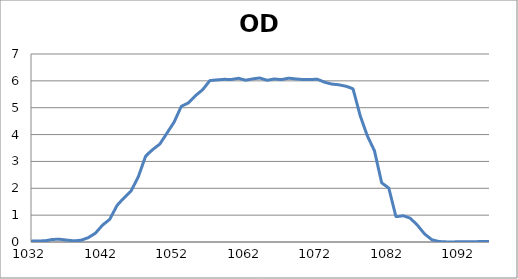
| Category | Series 0 |
|---|---|
| 2600.0 | 0.188 |
| 2599.0 | 0.186 |
| 2598.0 | 0.183 |
| 2597.0 | 0.181 |
| 2596.0 | 0.179 |
| 2595.0 | 0.178 |
| 2594.0 | 0.176 |
| 2593.0 | 0.175 |
| 2592.0 | 0.173 |
| 2591.0 | 0.172 |
| 2590.0 | 0.17 |
| 2589.0 | 0.169 |
| 2588.0 | 0.167 |
| 2587.0 | 0.166 |
| 2586.0 | 0.165 |
| 2585.0 | 0.164 |
| 2584.0 | 0.163 |
| 2583.0 | 0.162 |
| 2582.0 | 0.16 |
| 2581.0 | 0.158 |
| 2580.0 | 0.156 |
| 2579.0 | 0.154 |
| 2578.0 | 0.152 |
| 2577.0 | 0.15 |
| 2576.0 | 0.148 |
| 2575.0 | 0.145 |
| 2574.0 | 0.143 |
| 2573.0 | 0.141 |
| 2572.0 | 0.139 |
| 2571.0 | 0.137 |
| 2570.0 | 0.135 |
| 2569.0 | 0.133 |
| 2568.0 | 0.131 |
| 2567.0 | 0.13 |
| 2566.0 | 0.129 |
| 2565.0 | 0.128 |
| 2564.0 | 0.127 |
| 2563.0 | 0.127 |
| 2562.0 | 0.127 |
| 2561.0 | 0.127 |
| 2560.0 | 0.127 |
| 2559.0 | 0.127 |
| 2558.0 | 0.127 |
| 2557.0 | 0.127 |
| 2556.0 | 0.128 |
| 2555.0 | 0.128 |
| 2554.0 | 0.128 |
| 2553.0 | 0.128 |
| 2552.0 | 0.128 |
| 2551.0 | 0.128 |
| 2550.0 | 0.127 |
| 2549.0 | 0.127 |
| 2548.0 | 0.126 |
| 2547.0 | 0.124 |
| 2546.0 | 0.123 |
| 2545.0 | 0.122 |
| 2544.0 | 0.121 |
| 2543.0 | 0.12 |
| 2542.0 | 0.119 |
| 2541.0 | 0.118 |
| 2540.0 | 0.117 |
| 2539.0 | 0.117 |
| 2538.0 | 0.118 |
| 2537.0 | 0.118 |
| 2536.0 | 0.119 |
| 2535.0 | 0.12 |
| 2534.0 | 0.122 |
| 2533.0 | 0.124 |
| 2532.0 | 0.126 |
| 2531.0 | 0.128 |
| 2530.0 | 0.131 |
| 2529.0 | 0.134 |
| 2528.0 | 0.136 |
| 2527.0 | 0.139 |
| 2526.0 | 0.141 |
| 2525.0 | 0.144 |
| 2524.0 | 0.146 |
| 2523.0 | 0.148 |
| 2522.0 | 0.15 |
| 2521.0 | 0.151 |
| 2520.0 | 0.152 |
| 2519.0 | 0.153 |
| 2518.0 | 0.153 |
| 2517.0 | 0.153 |
| 2516.0 | 0.152 |
| 2515.0 | 0.151 |
| 2514.0 | 0.149 |
| 2513.0 | 0.148 |
| 2512.0 | 0.146 |
| 2511.0 | 0.144 |
| 2510.0 | 0.143 |
| 2509.0 | 0.141 |
| 2508.0 | 0.14 |
| 2507.0 | 0.139 |
| 2506.0 | 0.138 |
| 2505.0 | 0.137 |
| 2504.0 | 0.138 |
| 2503.0 | 0.138 |
| 2502.0 | 0.139 |
| 2501.0 | 0.141 |
| 2500.0 | 0.143 |
| 2499.0 | 0.145 |
| 2498.0 | 0.147 |
| 2497.0 | 0.15 |
| 2496.0 | 0.153 |
| 2495.0 | 0.155 |
| 2494.0 | 0.158 |
| 2493.0 | 0.161 |
| 2492.0 | 0.163 |
| 2491.0 | 0.165 |
| 2490.0 | 0.166 |
| 2489.0 | 0.167 |
| 2488.0 | 0.167 |
| 2487.0 | 0.167 |
| 2486.0 | 0.167 |
| 2485.0 | 0.165 |
| 2484.0 | 0.163 |
| 2483.0 | 0.161 |
| 2482.0 | 0.158 |
| 2481.0 | 0.155 |
| 2480.0 | 0.151 |
| 2479.0 | 0.147 |
| 2478.0 | 0.143 |
| 2477.0 | 0.139 |
| 2476.0 | 0.134 |
| 2475.0 | 0.13 |
| 2474.0 | 0.126 |
| 2473.0 | 0.122 |
| 2472.0 | 0.119 |
| 2471.0 | 0.115 |
| 2470.0 | 0.112 |
| 2469.0 | 0.11 |
| 2468.0 | 0.108 |
| 2467.0 | 0.106 |
| 2466.0 | 0.105 |
| 2465.0 | 0.104 |
| 2464.0 | 0.104 |
| 2463.0 | 0.103 |
| 2462.0 | 0.103 |
| 2461.0 | 0.103 |
| 2460.0 | 0.103 |
| 2459.0 | 0.103 |
| 2458.0 | 0.103 |
| 2457.0 | 0.103 |
| 2456.0 | 0.104 |
| 2455.0 | 0.104 |
| 2454.0 | 0.104 |
| 2453.0 | 0.104 |
| 2452.0 | 0.104 |
| 2451.0 | 0.104 |
| 2450.0 | 0.104 |
| 2449.0 | 0.104 |
| 2448.0 | 0.104 |
| 2447.0 | 0.105 |
| 2446.0 | 0.105 |
| 2445.0 | 0.106 |
| 2444.0 | 0.106 |
| 2443.0 | 0.107 |
| 2442.0 | 0.108 |
| 2441.0 | 0.108 |
| 2440.0 | 0.109 |
| 2439.0 | 0.11 |
| 2438.0 | 0.111 |
| 2437.0 | 0.112 |
| 2436.0 | 0.113 |
| 2435.0 | 0.113 |
| 2434.0 | 0.113 |
| 2433.0 | 0.114 |
| 2432.0 | 0.114 |
| 2431.0 | 0.113 |
| 2430.0 | 0.113 |
| 2429.0 | 0.113 |
| 2428.0 | 0.112 |
| 2427.0 | 0.112 |
| 2426.0 | 0.111 |
| 2425.0 | 0.111 |
| 2424.0 | 0.111 |
| 2423.0 | 0.111 |
| 2422.0 | 0.112 |
| 2421.0 | 0.113 |
| 2420.0 | 0.114 |
| 2419.0 | 0.116 |
| 2418.0 | 0.118 |
| 2417.0 | 0.12 |
| 2416.0 | 0.123 |
| 2415.0 | 0.126 |
| 2414.0 | 0.13 |
| 2413.0 | 0.133 |
| 2412.0 | 0.137 |
| 2411.0 | 0.14 |
| 2410.0 | 0.144 |
| 2409.0 | 0.147 |
| 2408.0 | 0.15 |
| 2407.0 | 0.153 |
| 2406.0 | 0.156 |
| 2405.0 | 0.158 |
| 2404.0 | 0.159 |
| 2403.0 | 0.161 |
| 2402.0 | 0.162 |
| 2401.0 | 0.162 |
| 2400.0 | 0.162 |
| 2399.0 | 0.162 |
| 2398.0 | 0.161 |
| 2397.0 | 0.16 |
| 2396.0 | 0.16 |
| 2395.0 | 0.16 |
| 2394.0 | 0.16 |
| 2393.0 | 0.16 |
| 2392.0 | 0.161 |
| 2391.0 | 0.162 |
| 2390.0 | 0.164 |
| 2389.0 | 0.166 |
| 2388.0 | 0.169 |
| 2387.0 | 0.172 |
| 2386.0 | 0.176 |
| 2385.0 | 0.18 |
| 2384.0 | 0.184 |
| 2383.0 | 0.189 |
| 2382.0 | 0.193 |
| 2381.0 | 0.197 |
| 2380.0 | 0.202 |
| 2379.0 | 0.205 |
| 2378.0 | 0.209 |
| 2377.0 | 0.211 |
| 2376.0 | 0.214 |
| 2375.0 | 0.215 |
| 2374.0 | 0.216 |
| 2373.0 | 0.216 |
| 2372.0 | 0.216 |
| 2371.0 | 0.215 |
| 2370.0 | 0.213 |
| 2369.0 | 0.212 |
| 2368.0 | 0.21 |
| 2367.0 | 0.208 |
| 2366.0 | 0.206 |
| 2365.0 | 0.203 |
| 2364.0 | 0.202 |
| 2363.0 | 0.2 |
| 2362.0 | 0.199 |
| 2361.0 | 0.198 |
| 2360.0 | 0.198 |
| 2359.0 | 0.198 |
| 2358.0 | 0.198 |
| 2357.0 | 0.198 |
| 2356.0 | 0.199 |
| 2355.0 | 0.201 |
| 2354.0 | 0.202 |
| 2353.0 | 0.203 |
| 2352.0 | 0.204 |
| 2351.0 | 0.205 |
| 2350.0 | 0.205 |
| 2349.0 | 0.205 |
| 2348.0 | 0.205 |
| 2347.0 | 0.203 |
| 2346.0 | 0.202 |
| 2345.0 | 0.199 |
| 2344.0 | 0.197 |
| 2343.0 | 0.193 |
| 2342.0 | 0.19 |
| 2341.0 | 0.187 |
| 2340.0 | 0.183 |
| 2339.0 | 0.18 |
| 2338.0 | 0.177 |
| 2337.0 | 0.174 |
| 2336.0 | 0.172 |
| 2335.0 | 0.17 |
| 2334.0 | 0.168 |
| 2333.0 | 0.168 |
| 2332.0 | 0.167 |
| 2331.0 | 0.168 |
| 2330.0 | 0.168 |
| 2329.0 | 0.169 |
| 2328.0 | 0.17 |
| 2327.0 | 0.171 |
| 2326.0 | 0.172 |
| 2325.0 | 0.173 |
| 2324.0 | 0.173 |
| 2323.0 | 0.173 |
| 2322.0 | 0.173 |
| 2321.0 | 0.172 |
| 2320.0 | 0.17 |
| 2319.0 | 0.168 |
| 2318.0 | 0.166 |
| 2317.0 | 0.164 |
| 2316.0 | 0.162 |
| 2315.0 | 0.16 |
| 2314.0 | 0.158 |
| 2313.0 | 0.157 |
| 2312.0 | 0.157 |
| 2311.0 | 0.157 |
| 2310.0 | 0.159 |
| 2309.0 | 0.162 |
| 2308.0 | 0.167 |
| 2307.0 | 0.172 |
| 2306.0 | 0.178 |
| 2305.0 | 0.185 |
| 2304.0 | 0.192 |
| 2303.0 | 0.2 |
| 2302.0 | 0.208 |
| 2301.0 | 0.216 |
| 2300.0 | 0.223 |
| 2299.0 | 0.23 |
| 2298.0 | 0.235 |
| 2297.0 | 0.239 |
| 2296.0 | 0.241 |
| 2295.0 | 0.243 |
| 2294.0 | 0.243 |
| 2293.0 | 0.242 |
| 2292.0 | 0.24 |
| 2291.0 | 0.236 |
| 2290.0 | 0.232 |
| 2289.0 | 0.228 |
| 2288.0 | 0.223 |
| 2287.0 | 0.218 |
| 2286.0 | 0.215 |
| 2285.0 | 0.212 |
| 2284.0 | 0.21 |
| 2283.0 | 0.21 |
| 2282.0 | 0.211 |
| 2281.0 | 0.215 |
| 2280.0 | 0.22 |
| 2279.0 | 0.227 |
| 2278.0 | 0.235 |
| 2277.0 | 0.245 |
| 2276.0 | 0.256 |
| 2275.0 | 0.268 |
| 2274.0 | 0.281 |
| 2273.0 | 0.293 |
| 2272.0 | 0.304 |
| 2271.0 | 0.315 |
| 2270.0 | 0.324 |
| 2269.0 | 0.331 |
| 2268.0 | 0.337 |
| 2267.0 | 0.341 |
| 2266.0 | 0.344 |
| 2265.0 | 0.345 |
| 2264.0 | 0.344 |
| 2263.0 | 0.341 |
| 2262.0 | 0.338 |
| 2261.0 | 0.333 |
| 2260.0 | 0.329 |
| 2259.0 | 0.323 |
| 2258.0 | 0.318 |
| 2257.0 | 0.313 |
| 2256.0 | 0.309 |
| 2255.0 | 0.306 |
| 2254.0 | 0.304 |
| 2253.0 | 0.302 |
| 2252.0 | 0.303 |
| 2251.0 | 0.304 |
| 2250.0 | 0.306 |
| 2249.0 | 0.309 |
| 2248.0 | 0.312 |
| 2247.0 | 0.316 |
| 2246.0 | 0.319 |
| 2245.0 | 0.323 |
| 2244.0 | 0.325 |
| 2243.0 | 0.327 |
| 2242.0 | 0.328 |
| 2241.0 | 0.328 |
| 2240.0 | 0.326 |
| 2239.0 | 0.323 |
| 2238.0 | 0.319 |
| 2237.0 | 0.313 |
| 2236.0 | 0.306 |
| 2235.0 | 0.298 |
| 2234.0 | 0.291 |
| 2233.0 | 0.283 |
| 2232.0 | 0.275 |
| 2231.0 | 0.267 |
| 2230.0 | 0.261 |
| 2229.0 | 0.256 |
| 2228.0 | 0.251 |
| 2227.0 | 0.248 |
| 2226.0 | 0.246 |
| 2225.0 | 0.245 |
| 2224.0 | 0.246 |
| 2223.0 | 0.247 |
| 2222.0 | 0.249 |
| 2221.0 | 0.252 |
| 2220.0 | 0.254 |
| 2219.0 | 0.257 |
| 2218.0 | 0.259 |
| 2217.0 | 0.261 |
| 2216.0 | 0.262 |
| 2215.0 | 0.262 |
| 2214.0 | 0.263 |
| 2213.0 | 0.262 |
| 2212.0 | 0.262 |
| 2211.0 | 0.261 |
| 2210.0 | 0.26 |
| 2209.0 | 0.259 |
| 2208.0 | 0.259 |
| 2207.0 | 0.26 |
| 2206.0 | 0.261 |
| 2205.0 | 0.263 |
| 2204.0 | 0.266 |
| 2203.0 | 0.271 |
| 2202.0 | 0.276 |
| 2201.0 | 0.282 |
| 2200.0 | 0.289 |
| 2199.0 | 0.296 |
| 2198.0 | 0.303 |
| 2197.0 | 0.311 |
| 2196.0 | 0.318 |
| 2195.0 | 0.326 |
| 2194.0 | 0.333 |
| 2193.0 | 0.339 |
| 2192.0 | 0.345 |
| 2191.0 | 0.35 |
| 2190.0 | 0.356 |
| 2189.0 | 0.36 |
| 2188.0 | 0.365 |
| 2187.0 | 0.369 |
| 2186.0 | 0.373 |
| 2185.0 | 0.376 |
| 2184.0 | 0.38 |
| 2183.0 | 0.383 |
| 2182.0 | 0.386 |
| 2181.0 | 0.389 |
| 2180.0 | 0.392 |
| 2179.0 | 0.394 |
| 2178.0 | 0.396 |
| 2177.0 | 0.397 |
| 2176.0 | 0.398 |
| 2175.0 | 0.397 |
| 2174.0 | 0.397 |
| 2173.0 | 0.395 |
| 2172.0 | 0.393 |
| 2171.0 | 0.39 |
| 2170.0 | 0.387 |
| 2169.0 | 0.383 |
| 2168.0 | 0.38 |
| 2167.0 | 0.377 |
| 2166.0 | 0.375 |
| 2165.0 | 0.373 |
| 2164.0 | 0.373 |
| 2163.0 | 0.374 |
| 2162.0 | 0.377 |
| 2161.0 | 0.382 |
| 2160.0 | 0.388 |
| 2159.0 | 0.395 |
| 2158.0 | 0.404 |
| 2157.0 | 0.414 |
| 2156.0 | 0.424 |
| 2155.0 | 0.434 |
| 2154.0 | 0.443 |
| 2153.0 | 0.451 |
| 2152.0 | 0.458 |
| 2151.0 | 0.463 |
| 2150.0 | 0.466 |
| 2149.0 | 0.466 |
| 2148.0 | 0.464 |
| 2147.0 | 0.459 |
| 2146.0 | 0.451 |
| 2145.0 | 0.442 |
| 2144.0 | 0.431 |
| 2143.0 | 0.418 |
| 2142.0 | 0.404 |
| 2141.0 | 0.39 |
| 2140.0 | 0.375 |
| 2139.0 | 0.363 |
| 2138.0 | 0.353 |
| 2137.0 | 0.344 |
| 2136.0 | 0.338 |
| 2135.0 | 0.335 |
| 2134.0 | 0.334 |
| 2133.0 | 0.336 |
| 2132.0 | 0.341 |
| 2131.0 | 0.347 |
| 2130.0 | 0.354 |
| 2129.0 | 0.362 |
| 2128.0 | 0.369 |
| 2127.0 | 0.376 |
| 2126.0 | 0.381 |
| 2125.0 | 0.384 |
| 2124.0 | 0.385 |
| 2123.0 | 0.383 |
| 2122.0 | 0.378 |
| 2121.0 | 0.371 |
| 2120.0 | 0.362 |
| 2119.0 | 0.35 |
| 2118.0 | 0.337 |
| 2117.0 | 0.322 |
| 2116.0 | 0.308 |
| 2115.0 | 0.294 |
| 2114.0 | 0.281 |
| 2113.0 | 0.27 |
| 2112.0 | 0.262 |
| 2111.0 | 0.257 |
| 2110.0 | 0.254 |
| 2109.0 | 0.255 |
| 2108.0 | 0.257 |
| 2107.0 | 0.261 |
| 2106.0 | 0.266 |
| 2105.0 | 0.272 |
| 2104.0 | 0.277 |
| 2103.0 | 0.28 |
| 2102.0 | 0.283 |
| 2101.0 | 0.284 |
| 2100.0 | 0.283 |
| 2099.0 | 0.28 |
| 2098.0 | 0.275 |
| 2097.0 | 0.27 |
| 2096.0 | 0.264 |
| 2095.0 | 0.258 |
| 2094.0 | 0.253 |
| 2093.0 | 0.249 |
| 2092.0 | 0.247 |
| 2091.0 | 0.246 |
| 2090.0 | 0.249 |
| 2089.0 | 0.253 |
| 2088.0 | 0.26 |
| 2087.0 | 0.268 |
| 2086.0 | 0.278 |
| 2085.0 | 0.289 |
| 2084.0 | 0.299 |
| 2083.0 | 0.309 |
| 2082.0 | 0.318 |
| 2081.0 | 0.324 |
| 2080.0 | 0.329 |
| 2079.0 | 0.331 |
| 2078.0 | 0.33 |
| 2077.0 | 0.328 |
| 2076.0 | 0.324 |
| 2075.0 | 0.318 |
| 2074.0 | 0.311 |
| 2073.0 | 0.305 |
| 2072.0 | 0.3 |
| 2071.0 | 0.296 |
| 2070.0 | 0.296 |
| 2069.0 | 0.298 |
| 2068.0 | 0.303 |
| 2067.0 | 0.311 |
| 2066.0 | 0.321 |
| 2065.0 | 0.333 |
| 2064.0 | 0.346 |
| 2063.0 | 0.36 |
| 2062.0 | 0.373 |
| 2061.0 | 0.384 |
| 2060.0 | 0.394 |
| 2059.0 | 0.401 |
| 2058.0 | 0.406 |
| 2057.0 | 0.407 |
| 2056.0 | 0.406 |
| 2055.0 | 0.403 |
| 2054.0 | 0.397 |
| 2053.0 | 0.39 |
| 2052.0 | 0.381 |
| 2051.0 | 0.373 |
| 2050.0 | 0.364 |
| 2049.0 | 0.356 |
| 2048.0 | 0.349 |
| 2047.0 | 0.345 |
| 2046.0 | 0.343 |
| 2045.0 | 0.344 |
| 2044.0 | 0.346 |
| 2043.0 | 0.351 |
| 2042.0 | 0.356 |
| 2041.0 | 0.362 |
| 2040.0 | 0.368 |
| 2039.0 | 0.373 |
| 2038.0 | 0.375 |
| 2037.0 | 0.376 |
| 2036.0 | 0.374 |
| 2035.0 | 0.37 |
| 2034.0 | 0.362 |
| 2033.0 | 0.353 |
| 2032.0 | 0.342 |
| 2031.0 | 0.33 |
| 2030.0 | 0.317 |
| 2029.0 | 0.305 |
| 2028.0 | 0.295 |
| 2027.0 | 0.288 |
| 2026.0 | 0.283 |
| 2025.0 | 0.281 |
| 2024.0 | 0.282 |
| 2023.0 | 0.286 |
| 2022.0 | 0.293 |
| 2021.0 | 0.3 |
| 2020.0 | 0.309 |
| 2019.0 | 0.316 |
| 2018.0 | 0.323 |
| 2017.0 | 0.329 |
| 2016.0 | 0.332 |
| 2015.0 | 0.333 |
| 2014.0 | 0.332 |
| 2013.0 | 0.329 |
| 2012.0 | 0.325 |
| 2011.0 | 0.319 |
| 2010.0 | 0.314 |
| 2009.0 | 0.31 |
| 2008.0 | 0.306 |
| 2007.0 | 0.305 |
| 2006.0 | 0.306 |
| 2005.0 | 0.309 |
| 2004.0 | 0.315 |
| 2003.0 | 0.323 |
| 2002.0 | 0.334 |
| 2001.0 | 0.345 |
| 2000.0 | 0.356 |
| 1999.0 | 0.367 |
| 1998.0 | 0.376 |
| 1997.0 | 0.384 |
| 1996.0 | 0.389 |
| 1995.0 | 0.391 |
| 1994.0 | 0.391 |
| 1993.0 | 0.389 |
| 1992.0 | 0.385 |
| 1991.0 | 0.38 |
| 1990.0 | 0.376 |
| 1989.0 | 0.372 |
| 1988.0 | 0.369 |
| 1987.0 | 0.369 |
| 1986.0 | 0.371 |
| 1985.0 | 0.376 |
| 1984.0 | 0.383 |
| 1983.0 | 0.393 |
| 1982.0 | 0.404 |
| 1981.0 | 0.415 |
| 1980.0 | 0.426 |
| 1979.0 | 0.436 |
| 1978.0 | 0.445 |
| 1977.0 | 0.452 |
| 1976.0 | 0.456 |
| 1975.0 | 0.457 |
| 1974.0 | 0.456 |
| 1973.0 | 0.453 |
| 1972.0 | 0.447 |
| 1971.0 | 0.441 |
| 1970.0 | 0.434 |
| 1969.0 | 0.425 |
| 1968.0 | 0.418 |
| 1967.0 | 0.412 |
| 1966.0 | 0.408 |
| 1965.0 | 0.406 |
| 1964.0 | 0.405 |
| 1963.0 | 0.408 |
| 1962.0 | 0.411 |
| 1961.0 | 0.415 |
| 1960.0 | 0.419 |
| 1959.0 | 0.423 |
| 1958.0 | 0.426 |
| 1957.0 | 0.428 |
| 1956.0 | 0.427 |
| 1955.0 | 0.424 |
| 1954.0 | 0.419 |
| 1953.0 | 0.412 |
| 1952.0 | 0.403 |
| 1951.0 | 0.393 |
| 1950.0 | 0.383 |
| 1949.0 | 0.373 |
| 1948.0 | 0.364 |
| 1947.0 | 0.356 |
| 1946.0 | 0.35 |
| 1945.0 | 0.346 |
| 1944.0 | 0.343 |
| 1943.0 | 0.342 |
| 1942.0 | 0.341 |
| 1941.0 | 0.34 |
| 1940.0 | 0.34 |
| 1939.0 | 0.339 |
| 1938.0 | 0.336 |
| 1937.0 | 0.333 |
| 1936.0 | 0.328 |
| 1935.0 | 0.323 |
| 1934.0 | 0.317 |
| 1933.0 | 0.311 |
| 1932.0 | 0.306 |
| 1931.0 | 0.302 |
| 1930.0 | 0.3 |
| 1929.0 | 0.3 |
| 1928.0 | 0.301 |
| 1927.0 | 0.304 |
| 1926.0 | 0.308 |
| 1925.0 | 0.312 |
| 1924.0 | 0.316 |
| 1923.0 | 0.319 |
| 1922.0 | 0.322 |
| 1921.0 | 0.323 |
| 1920.0 | 0.323 |
| 1919.0 | 0.32 |
| 1918.0 | 0.316 |
| 1917.0 | 0.311 |
| 1916.0 | 0.305 |
| 1915.0 | 0.301 |
| 1914.0 | 0.3 |
| 1913.0 | 0.302 |
| 1912.0 | 0.307 |
| 1911.0 | 0.314 |
| 1910.0 | 0.323 |
| 1909.0 | 0.334 |
| 1908.0 | 0.347 |
| 1907.0 | 0.364 |
| 1906.0 | 0.382 |
| 1905.0 | 0.398 |
| 1904.0 | 0.409 |
| 1903.0 | 0.416 |
| 1902.0 | 0.419 |
| 1901.0 | 0.42 |
| 1900.0 | 0.417 |
| 1899.0 | 0.414 |
| 1898.0 | 0.41 |
| 1897.0 | 0.405 |
| 1896.0 | 0.401 |
| 1895.0 | 0.399 |
| 1894.0 | 0.401 |
| 1893.0 | 0.408 |
| 1892.0 | 0.421 |
| 1891.0 | 0.437 |
| 1890.0 | 0.454 |
| 1889.0 | 0.473 |
| 1888.0 | 0.49 |
| 1887.0 | 0.506 |
| 1886.0 | 0.52 |
| 1885.0 | 0.533 |
| 1884.0 | 0.542 |
| 1883.0 | 0.545 |
| 1882.0 | 0.542 |
| 1881.0 | 0.533 |
| 1880.0 | 0.519 |
| 1879.0 | 0.501 |
| 1878.0 | 0.479 |
| 1877.0 | 0.457 |
| 1876.0 | 0.437 |
| 1875.0 | 0.418 |
| 1874.0 | 0.404 |
| 1873.0 | 0.397 |
| 1872.0 | 0.394 |
| 1871.0 | 0.397 |
| 1870.0 | 0.407 |
| 1869.0 | 0.419 |
| 1868.0 | 0.433 |
| 1867.0 | 0.444 |
| 1866.0 | 0.454 |
| 1865.0 | 0.46 |
| 1864.0 | 0.462 |
| 1863.0 | 0.461 |
| 1862.0 | 0.455 |
| 1861.0 | 0.444 |
| 1860.0 | 0.43 |
| 1859.0 | 0.411 |
| 1858.0 | 0.392 |
| 1857.0 | 0.372 |
| 1856.0 | 0.352 |
| 1855.0 | 0.335 |
| 1854.0 | 0.32 |
| 1853.0 | 0.31 |
| 1852.0 | 0.303 |
| 1851.0 | 0.3 |
| 1850.0 | 0.3 |
| 1849.0 | 0.303 |
| 1848.0 | 0.31 |
| 1847.0 | 0.317 |
| 1846.0 | 0.322 |
| 1845.0 | 0.324 |
| 1844.0 | 0.323 |
| 1843.0 | 0.321 |
| 1842.0 | 0.318 |
| 1841.0 | 0.317 |
| 1840.0 | 0.313 |
| 1839.0 | 0.307 |
| 1838.0 | 0.301 |
| 1837.0 | 0.293 |
| 1836.0 | 0.286 |
| 1835.0 | 0.28 |
| 1834.0 | 0.274 |
| 1833.0 | 0.269 |
| 1832.0 | 0.264 |
| 1831.0 | 0.262 |
| 1830.0 | 0.261 |
| 1829.0 | 0.263 |
| 1828.0 | 0.268 |
| 1827.0 | 0.277 |
| 1826.0 | 0.288 |
| 1825.0 | 0.3 |
| 1824.0 | 0.313 |
| 1823.0 | 0.327 |
| 1822.0 | 0.344 |
| 1821.0 | 0.361 |
| 1820.0 | 0.376 |
| 1819.0 | 0.384 |
| 1818.0 | 0.386 |
| 1817.0 | 0.384 |
| 1816.0 | 0.378 |
| 1815.0 | 0.368 |
| 1814.0 | 0.356 |
| 1813.0 | 0.342 |
| 1812.0 | 0.327 |
| 1811.0 | 0.314 |
| 1810.0 | 0.305 |
| 1809.0 | 0.303 |
| 1808.0 | 0.308 |
| 1807.0 | 0.32 |
| 1806.0 | 0.34 |
| 1805.0 | 0.364 |
| 1804.0 | 0.391 |
| 1803.0 | 0.417 |
| 1802.0 | 0.44 |
| 1801.0 | 0.458 |
| 1800.0 | 0.471 |
| 1799.0 | 0.475 |
| 1798.0 | 0.47 |
| 1797.0 | 0.457 |
| 1796.0 | 0.437 |
| 1795.0 | 0.411 |
| 1794.0 | 0.381 |
| 1793.0 | 0.352 |
| 1792.0 | 0.325 |
| 1791.0 | 0.305 |
| 1790.0 | 0.295 |
| 1789.0 | 0.294 |
| 1788.0 | 0.304 |
| 1787.0 | 0.32 |
| 1786.0 | 0.341 |
| 1785.0 | 0.362 |
| 1784.0 | 0.382 |
| 1783.0 | 0.395 |
| 1782.0 | 0.402 |
| 1781.0 | 0.4 |
| 1780.0 | 0.39 |
| 1779.0 | 0.374 |
| 1778.0 | 0.351 |
| 1777.0 | 0.326 |
| 1776.0 | 0.299 |
| 1775.0 | 0.273 |
| 1774.0 | 0.253 |
| 1773.0 | 0.239 |
| 1772.0 | 0.232 |
| 1771.0 | 0.232 |
| 1770.0 | 0.238 |
| 1769.0 | 0.248 |
| 1768.0 | 0.259 |
| 1767.0 | 0.268 |
| 1766.0 | 0.274 |
| 1765.0 | 0.275 |
| 1764.0 | 0.27 |
| 1763.0 | 0.259 |
| 1762.0 | 0.247 |
| 1761.0 | 0.234 |
| 1760.0 | 0.224 |
| 1759.0 | 0.22 |
| 1758.0 | 0.224 |
| 1757.0 | 0.237 |
| 1756.0 | 0.258 |
| 1755.0 | 0.285 |
| 1754.0 | 0.314 |
| 1753.0 | 0.342 |
| 1752.0 | 0.367 |
| 1751.0 | 0.384 |
| 1750.0 | 0.393 |
| 1749.0 | 0.393 |
| 1748.0 | 0.384 |
| 1747.0 | 0.368 |
| 1746.0 | 0.345 |
| 1745.0 | 0.32 |
| 1744.0 | 0.295 |
| 1743.0 | 0.275 |
| 1742.0 | 0.263 |
| 1741.0 | 0.26 |
| 1740.0 | 0.268 |
| 1739.0 | 0.285 |
| 1738.0 | 0.309 |
| 1737.0 | 0.335 |
| 1736.0 | 0.361 |
| 1735.0 | 0.383 |
| 1734.0 | 0.4 |
| 1733.0 | 0.41 |
| 1732.0 | 0.412 |
| 1731.0 | 0.406 |
| 1730.0 | 0.393 |
| 1729.0 | 0.373 |
| 1728.0 | 0.349 |
| 1727.0 | 0.323 |
| 1726.0 | 0.296 |
| 1725.0 | 0.273 |
| 1724.0 | 0.253 |
| 1723.0 | 0.24 |
| 1722.0 | 0.232 |
| 1721.0 | 0.229 |
| 1720.0 | 0.23 |
| 1719.0 | 0.233 |
| 1718.0 | 0.236 |
| 1717.0 | 0.238 |
| 1716.0 | 0.236 |
| 1715.0 | 0.232 |
| 1714.0 | 0.224 |
| 1713.0 | 0.216 |
| 1712.0 | 0.206 |
| 1711.0 | 0.197 |
| 1710.0 | 0.189 |
| 1709.0 | 0.182 |
| 1708.0 | 0.178 |
| 1707.0 | 0.175 |
| 1706.0 | 0.174 |
| 1705.0 | 0.173 |
| 1704.0 | 0.172 |
| 1703.0 | 0.172 |
| 1702.0 | 0.172 |
| 1701.0 | 0.173 |
| 1700.0 | 0.176 |
| 1699.0 | 0.182 |
| 1698.0 | 0.19 |
| 1697.0 | 0.201 |
| 1696.0 | 0.215 |
| 1695.0 | 0.229 |
| 1694.0 | 0.244 |
| 1693.0 | 0.257 |
| 1692.0 | 0.267 |
| 1691.0 | 0.273 |
| 1690.0 | 0.274 |
| 1689.0 | 0.27 |
| 1688.0 | 0.261 |
| 1687.0 | 0.247 |
| 1686.0 | 0.231 |
| 1685.0 | 0.214 |
| 1684.0 | 0.199 |
| 1683.0 | 0.188 |
| 1682.0 | 0.182 |
| 1681.0 | 0.183 |
| 1680.0 | 0.191 |
| 1679.0 | 0.203 |
| 1678.0 | 0.219 |
| 1677.0 | 0.235 |
| 1676.0 | 0.249 |
| 1675.0 | 0.258 |
| 1674.0 | 0.262 |
| 1673.0 | 0.261 |
| 1672.0 | 0.253 |
| 1671.0 | 0.241 |
| 1670.0 | 0.225 |
| 1669.0 | 0.207 |
| 1668.0 | 0.189 |
| 1667.0 | 0.175 |
| 1666.0 | 0.163 |
| 1665.0 | 0.156 |
| 1664.0 | 0.153 |
| 1663.0 | 0.154 |
| 1662.0 | 0.157 |
| 1661.0 | 0.16 |
| 1660.0 | 0.164 |
| 1659.0 | 0.166 |
| 1658.0 | 0.166 |
| 1657.0 | 0.165 |
| 1656.0 | 0.162 |
| 1655.0 | 0.158 |
| 1654.0 | 0.154 |
| 1653.0 | 0.15 |
| 1652.0 | 0.146 |
| 1651.0 | 0.143 |
| 1650.0 | 0.142 |
| 1649.0 | 0.14 |
| 1648.0 | 0.14 |
| 1647.0 | 0.138 |
| 1646.0 | 0.137 |
| 1645.0 | 0.135 |
| 1644.0 | 0.132 |
| 1643.0 | 0.129 |
| 1642.0 | 0.127 |
| 1641.0 | 0.125 |
| 1640.0 | 0.125 |
| 1639.0 | 0.126 |
| 1638.0 | 0.128 |
| 1637.0 | 0.132 |
| 1636.0 | 0.136 |
| 1635.0 | 0.14 |
| 1634.0 | 0.142 |
| 1633.0 | 0.143 |
| 1632.0 | 0.141 |
| 1631.0 | 0.138 |
| 1630.0 | 0.132 |
| 1629.0 | 0.126 |
| 1628.0 | 0.12 |
| 1627.0 | 0.114 |
| 1626.0 | 0.11 |
| 1625.0 | 0.108 |
| 1624.0 | 0.109 |
| 1623.0 | 0.112 |
| 1622.0 | 0.117 |
| 1621.0 | 0.122 |
| 1620.0 | 0.127 |
| 1619.0 | 0.131 |
| 1618.0 | 0.133 |
| 1617.0 | 0.133 |
| 1616.0 | 0.131 |
| 1615.0 | 0.127 |
| 1614.0 | 0.122 |
| 1613.0 | 0.116 |
| 1612.0 | 0.11 |
| 1611.0 | 0.106 |
| 1610.0 | 0.104 |
| 1609.0 | 0.103 |
| 1608.0 | 0.105 |
| 1607.0 | 0.108 |
| 1606.0 | 0.111 |
| 1605.0 | 0.115 |
| 1604.0 | 0.118 |
| 1603.0 | 0.12 |
| 1602.0 | 0.119 |
| 1601.0 | 0.117 |
| 1600.0 | 0.113 |
| 1599.0 | 0.107 |
| 1598.0 | 0.103 |
| 1597.0 | 0.098 |
| 1596.0 | 0.096 |
| 1595.0 | 0.095 |
| 1594.0 | 0.096 |
| 1593.0 | 0.099 |
| 1592.0 | 0.103 |
| 1591.0 | 0.106 |
| 1590.0 | 0.108 |
| 1589.0 | 0.108 |
| 1588.0 | 0.106 |
| 1587.0 | 0.103 |
| 1586.0 | 0.098 |
| 1585.0 | 0.093 |
| 1584.0 | 0.088 |
| 1583.0 | 0.085 |
| 1582.0 | 0.083 |
| 1581.0 | 0.083 |
| 1580.0 | 0.085 |
| 1579.0 | 0.087 |
| 1578.0 | 0.089 |
| 1577.0 | 0.09 |
| 1576.0 | 0.09 |
| 1575.0 | 0.088 |
| 1574.0 | 0.084 |
| 1573.0 | 0.08 |
| 1572.0 | 0.075 |
| 1571.0 | 0.071 |
| 1570.0 | 0.069 |
| 1569.0 | 0.068 |
| 1568.0 | 0.069 |
| 1567.0 | 0.071 |
| 1566.0 | 0.073 |
| 1565.0 | 0.076 |
| 1564.0 | 0.077 |
| 1563.0 | 0.076 |
| 1562.0 | 0.073 |
| 1561.0 | 0.069 |
| 1560.0 | 0.064 |
| 1559.0 | 0.059 |
| 1558.0 | 0.056 |
| 1557.0 | 0.055 |
| 1556.0 | 0.056 |
| 1555.0 | 0.06 |
| 1554.0 | 0.064 |
| 1553.0 | 0.068 |
| 1552.0 | 0.071 |
| 1551.0 | 0.071 |
| 1550.0 | 0.069 |
| 1549.0 | 0.065 |
| 1548.0 | 0.06 |
| 1547.0 | 0.054 |
| 1546.0 | 0.05 |
| 1545.0 | 0.047 |
| 1544.0 | 0.047 |
| 1543.0 | 0.049 |
| 1542.0 | 0.052 |
| 1541.0 | 0.056 |
| 1540.0 | 0.059 |
| 1539.0 | 0.06 |
| 1538.0 | 0.059 |
| 1537.0 | 0.056 |
| 1536.0 | 0.052 |
| 1535.0 | 0.047 |
| 1534.0 | 0.042 |
| 1533.0 | 0.039 |
| 1532.0 | 0.038 |
| 1531.0 | 0.039 |
| 1530.0 | 0.04 |
| 1529.0 | 0.042 |
| 1528.0 | 0.044 |
| 1527.0 | 0.044 |
| 1526.0 | 0.044 |
| 1525.0 | 0.042 |
| 1524.0 | 0.04 |
| 1523.0 | 0.038 |
| 1522.0 | 0.038 |
| 1521.0 | 0.039 |
| 1520.0 | 0.041 |
| 1519.0 | 0.045 |
| 1518.0 | 0.048 |
| 1517.0 | 0.05 |
| 1516.0 | 0.049 |
| 1515.0 | 0.046 |
| 1514.0 | 0.042 |
| 1513.0 | 0.035 |
| 1512.0 | 0.03 |
| 1511.0 | 0.027 |
| 1510.0 | 0.026 |
| 1509.0 | 0.029 |
| 1508.0 | 0.033 |
| 1507.0 | 0.039 |
| 1506.0 | 0.043 |
| 1505.0 | 0.045 |
| 1504.0 | 0.045 |
| 1503.0 | 0.041 |
| 1502.0 | 0.036 |
| 1501.0 | 0.03 |
| 1500.0 | 0.024 |
| 1499.0 | 0.021 |
| 1498.0 | 0.022 |
| 1497.0 | 0.025 |
| 1496.0 | 0.03 |
| 1495.0 | 0.036 |
| 1494.0 | 0.04 |
| 1493.0 | 0.042 |
| 1492.0 | 0.041 |
| 1491.0 | 0.037 |
| 1490.0 | 0.031 |
| 1489.0 | 0.025 |
| 1488.0 | 0.02 |
| 1487.0 | 0.017 |
| 1486.0 | 0.017 |
| 1485.0 | 0.021 |
| 1484.0 | 0.026 |
| 1483.0 | 0.031 |
| 1482.0 | 0.035 |
| 1481.0 | 0.035 |
| 1480.0 | 0.032 |
| 1479.0 | 0.027 |
| 1478.0 | 0.021 |
| 1477.0 | 0.016 |
| 1476.0 | 0.013 |
| 1475.0 | 0.015 |
| 1474.0 | 0.021 |
| 1473.0 | 0.028 |
| 1472.0 | 0.036 |
| 1471.0 | 0.043 |
| 1470.0 | 0.046 |
| 1469.0 | 0.045 |
| 1468.0 | 0.039 |
| 1467.0 | 0.031 |
| 1466.0 | 0.023 |
| 1465.0 | 0.016 |
| 1464.0 | 0.012 |
| 1463.0 | 0.01 |
| 1462.0 | 0.013 |
| 1461.0 | 0.016 |
| 1460.0 | 0.021 |
| 1459.0 | 0.025 |
| 1458.0 | 0.027 |
| 1457.0 | 0.027 |
| 1456.0 | 0.025 |
| 1455.0 | 0.021 |
| 1454.0 | 0.017 |
| 1453.0 | 0.014 |
| 1452.0 | 0.011 |
| 1451.0 | 0.01 |
| 1450.0 | 0.01 |
| 1449.0 | 0.01 |
| 1448.0 | 0.011 |
| 1447.0 | 0.012 |
| 1446.0 | 0.011 |
| 1445.0 | 0.01 |
| 1444.0 | 0.009 |
| 1443.0 | 0.007 |
| 1442.0 | 0.006 |
| 1441.0 | 0.005 |
| 1440.0 | 0.005 |
| 1439.0 | 0.005 |
| 1438.0 | 0.006 |
| 1437.0 | 0.006 |
| 1436.0 | 0.006 |
| 1435.0 | 0.006 |
| 1434.0 | 0.005 |
| 1433.0 | 0.005 |
| 1432.0 | 0.005 |
| 1431.0 | 0.005 |
| 1430.0 | 0.005 |
| 1429.0 | 0.005 |
| 1428.0 | 0.005 |
| 1427.0 | 0.005 |
| 1426.0 | 0.005 |
| 1425.0 | 0.004 |
| 1424.0 | 0.004 |
| 1423.0 | 0.004 |
| 1422.0 | 0.004 |
| 1421.0 | 0.004 |
| 1420.0 | 0.004 |
| 1419.0 | 0.005 |
| 1418.0 | 0.005 |
| 1417.0 | 0.005 |
| 1416.0 | 0.005 |
| 1415.0 | 0.005 |
| 1414.0 | 0.006 |
| 1413.0 | 0.006 |
| 1412.0 | 0.007 |
| 1411.0 | 0.007 |
| 1410.0 | 0.008 |
| 1409.0 | 0.007 |
| 1408.0 | 0.007 |
| 1407.0 | 0.007 |
| 1406.0 | 0.007 |
| 1405.0 | 0.007 |
| 1404.0 | 0.007 |
| 1403.0 | 0.007 |
| 1402.0 | 0.008 |
| 1401.0 | 0.009 |
| 1400.0 | 0.022 |
| 1399.0 | 0.026 |
| 1398.0 | 0.002 |
| 1397.0 | 0.003 |
| 1396.0 | 0.009 |
| 1395.0 | 0.02 |
| 1394.0 | 0.022 |
| 1393.0 | 0 |
| 1392.0 | 0.01 |
| 1391.0 | 0.005 |
| 1390.0 | 0.028 |
| 1389.0 | 0.05 |
| 1388.0 | 0.057 |
| 1387.0 | 0.049 |
| 1386.0 | 0.028 |
| 1385.0 | 0.004 |
| 1384.0 | 0.001 |
| 1383.0 | 0.008 |
| 1382.0 | 0.03 |
| 1381.0 | 0.056 |
| 1380.0 | 0.031 |
| 1379.0 | 0.018 |
| 1378.0 | 0.012 |
| 1377.0 | 0.002 |
| 1376.0 | 0.001 |
| 1375.0 | 0.004 |
| 1374.0 | 0.014 |
| 1373.0 | 0.026 |
| 1372.0 | 0.039 |
| 1371.0 | 0.034 |
| 1370.0 | 0.027 |
| 1369.0 | 0.022 |
| 1368.0 | 0.005 |
| 1367.0 | 0.017 |
| 1366.0 | 0.01 |
| 1365.0 | 0.012 |
| 1364.0 | 0.007 |
| 1363.0 | 0.006 |
| 1362.0 | 0.013 |
| 1361.0 | 0.009 |
| 1360.0 | 0.03 |
| 1359.0 | 0.028 |
| 1358.0 | 0.012 |
| 1357.0 | 0.018 |
| 1356.0 | 0.015 |
| 1355.0 | 0.013 |
| 1354.0 | 0.026 |
| 1353.0 | 0.022 |
| 1352.0 | 0.005 |
| 1351.0 | 0.001 |
| 1350.0 | 0.002 |
| 1349.0 | 0.003 |
| 1348.0 | 0.003 |
| 1347.0 | 0.001 |
| 1346.0 | 0.003 |
| 1345.0 | 0 |
| 1344.0 | 0.007 |
| 1343.0 | 0.026 |
| 1342.0 | 0.001 |
| 1341.0 | 0 |
| 1340.0 | 0.002 |
| 1339.0 | 0.007 |
| 1338.0 | 0.002 |
| 1337.0 | 0 |
| 1336.0 | 0.027 |
| 1335.0 | 0.032 |
| 1334.0 | 0.034 |
| 1333.0 | 0.029 |
| 1332.0 | 0.001 |
| 1331.0 | 0.013 |
| 1330.0 | 0.015 |
| 1329.0 | 0.005 |
| 1328.0 | 0.01 |
| 1327.0 | 0 |
| 1326.0 | 0.002 |
| 1325.0 | 0.005 |
| 1324.0 | 0.001 |
| 1323.0 | 0.002 |
| 1322.0 | 0.003 |
| 1321.0 | 0.007 |
| 1320.0 | 0.001 |
| 1319.0 | 0.006 |
| 1318.0 | 0.015 |
| 1317.0 | 0.033 |
| 1316.0 | 0.038 |
| 1315.0 | 0.031 |
| 1314.0 | 0.016 |
| 1313.0 | 0.003 |
| 1312.0 | 0.008 |
| 1311.0 | 0.005 |
| 1310.0 | 0.001 |
| 1309.0 | 0.006 |
| 1308.0 | 0.025 |
| 1307.0 | 0.027 |
| 1306.0 | 0.002 |
| 1305.0 | 0.005 |
| 1304.0 | 0.002 |
| 1303.0 | 0.004 |
| 1302.0 | 0.002 |
| 1301.0 | 0.001 |
| 1300.0 | 0.001 |
| 1299.0 | 0.025 |
| 1298.0 | 0.033 |
| 1297.0 | 0.023 |
| 1296.0 | 0.004 |
| 1295.0 | 0.008 |
| 1294.0 | 0.007 |
| 1293.0 | 0.005 |
| 1292.0 | 0.005 |
| 1291.0 | 0.026 |
| 1290.0 | 0.023 |
| 1289.0 | 0.001 |
| 1288.0 | 0.011 |
| 1287.0 | 0.007 |
| 1286.0 | 0.001 |
| 1285.0 | 0.006 |
| 1284.0 | 0.003 |
| 1283.0 | 0.006 |
| 1282.0 | 0.01 |
| 1281.0 | 0.003 |
| 1280.0 | 0.015 |
| 1279.0 | 0.032 |
| 1278.0 | 0.029 |
| 1277.0 | 0.02 |
| 1276.0 | 0.002 |
| 1275.0 | 0.005 |
| 1274.0 | 0.005 |
| 1273.0 | 0.003 |
| 1272.0 | 0.009 |
| 1271.0 | 0.003 |
| 1270.0 | 0.004 |
| 1269.0 | 0.002 |
| 1268.0 | 0.009 |
| 1267.0 | 0.006 |
| 1266.0 | 0.014 |
| 1265.0 | 0.023 |
| 1264.0 | 0.006 |
| 1263.0 | 0.007 |
| 1262.0 | 0.001 |
| 1261.0 | 0.007 |
| 1260.0 | 0.006 |
| 1259.0 | 0.001 |
| 1258.0 | 0.002 |
| 1257.0 | 0.002 |
| 1256.0 | 0.002 |
| 1255.0 | 0 |
| 1254.0 | 0.007 |
| 1253.0 | 0.02 |
| 1252.0 | 0.042 |
| 1251.0 | 0.041 |
| 1250.0 | 0.019 |
| 1249.0 | 0.007 |
| 1248.0 | 0.008 |
| 1247.0 | 0.003 |
| 1246.0 | 0 |
| 1245.0 | 0.001 |
| 1244.0 | 0 |
| 1243.0 | 0.002 |
| 1242.0 | 0.01 |
| 1241.0 | 0.029 |
| 1240.0 | 0.034 |
| 1239.0 | 0.022 |
| 1238.0 | 0.001 |
| 1237.0 | 0.004 |
| 1236.0 | 0.006 |
| 1235.0 | 0.009 |
| 1234.0 | 0.009 |
| 1233.0 | 0.003 |
| 1232.0 | 0.007 |
| 1231.0 | 0.009 |
| 1230.0 | 0.008 |
| 1229.0 | 0.005 |
| 1228.0 | 0.014 |
| 1227.0 | 0.026 |
| 1226.0 | 0.015 |
| 1225.0 | 0.004 |
| 1224.0 | 0.005 |
| 1223.0 | 0.004 |
| 1222.0 | 0.008 |
| 1221.0 | 0.029 |
| 1220.0 | 0.038 |
| 1219.0 | 0.019 |
| 1218.0 | 0 |
| 1217.0 | 0.002 |
| 1216.0 | 0.005 |
| 1215.0 | 0.001 |
| 1214.0 | 0 |
| 1213.0 | 0.003 |
| 1212.0 | 0.001 |
| 1211.0 | 0.002 |
| 1210.0 | 0.014 |
| 1209.0 | 0.005 |
| 1208.0 | 0.019 |
| 1207.0 | 0.016 |
| 1206.0 | 0.011 |
| 1205.0 | 0.009 |
| 1204.0 | 0.03 |
| 1203.0 | 0.024 |
| 1202.0 | 0.005 |
| 1201.0 | 0.002 |
| 1200.0 | 0.006 |
| 1199.0 | 0.013 |
| 1198.0 | 0.03 |
| 1197.0 | 0.014 |
| 1196.0 | 0.003 |
| 1195.0 | 0.001 |
| 1194.0 | 0.001 |
| 1193.0 | 0.002 |
| 1192.0 | 0.003 |
| 1191.0 | 0 |
| 1190.0 | 0.013 |
| 1189.0 | 0.014 |
| 1188.0 | 0.004 |
| 1187.0 | 0.009 |
| 1186.0 | 0.016 |
| 1185.0 | 0.01 |
| 1184.0 | 0.007 |
| 1183.0 | 0.008 |
| 1182.0 | 0.013 |
| 1181.0 | 0.011 |
| 1180.0 | 0.005 |
| 1179.0 | 0.005 |
| 1178.0 | 0.006 |
| 1177.0 | 0.01 |
| 1176.0 | 0.026 |
| 1175.0 | 0.025 |
| 1174.0 | 0.018 |
| 1173.0 | 0.017 |
| 1172.0 | 0.008 |
| 1171.0 | 0.018 |
| 1170.0 | 0.03 |
| 1169.0 | 0.03 |
| 1168.0 | 0.025 |
| 1167.0 | 0.02 |
| 1166.0 | 0.018 |
| 1165.0 | 0.013 |
| 1164.0 | 0.018 |
| 1163.0 | 0.023 |
| 1162.0 | 0.017 |
| 1161.0 | 0.01 |
| 1160.0 | 0.005 |
| 1159.0 | 0.005 |
| 1158.0 | 0.015 |
| 1157.0 | 0.031 |
| 1156.0 | 0.02 |
| 1155.0 | 0.013 |
| 1154.0 | 0.008 |
| 1153.0 | 0.019 |
| 1152.0 | 0.025 |
| 1151.0 | 0.023 |
| 1150.0 | 0.02 |
| 1149.0 | 0.02 |
| 1148.0 | 0.021 |
| 1147.0 | 0.015 |
| 1146.0 | 0.008 |
| 1145.0 | 0.023 |
| 1144.0 | 0.02 |
| 1143.0 | 0.017 |
| 1142.0 | 0.018 |
| 1141.0 | 0.014 |
| 1140.0 | 0.033 |
| 1139.0 | 0.027 |
| 1138.0 | 0.021 |
| 1137.0 | 0.012 |
| 1136.0 | 0.009 |
| 1135.0 | 0.001 |
| 1134.0 | 0.011 |
| 1133.0 | 0.012 |
| 1132.0 | 0.01 |
| 1131.0 | 0.011 |
| 1130.0 | 0.02 |
| 1129.0 | 0.03 |
| 1128.0 | 0.001 |
| 1127.0 | 0.019 |
| 1126.0 | 0.026 |
| 1125.0 | 0.02 |
| 1124.0 | 0.01 |
| 1123.0 | 0.01 |
| 1122.0 | 0.01 |
| 1121.0 | 0.008 |
| 1120.0 | 0.008 |
| 1119.0 | 0.014 |
| 1118.0 | 0.017 |
| 1117.0 | 0.014 |
| 1116.0 | 0.012 |
| 1115.0 | 0.005 |
| 1114.0 | 0.001 |
| 1113.0 | 0.004 |
| 1112.0 | 0.009 |
| 1111.0 | 0.015 |
| 1110.0 | 0.014 |
| 1109.0 | 0.008 |
| 1108.0 | 0.017 |
| 1107.0 | 0.018 |
| 1106.0 | 0.022 |
| 1105.0 | 0.026 |
| 1104.0 | 0.027 |
| 1103.0 | 0.023 |
| 1102.0 | 0.012 |
| 1101.0 | 0.009 |
| 1100.0 | 0.004 |
| 1099.0 | 0.023 |
| 1098.0 | 0.032 |
| 1097.0 | 0.001 |
| 1096.0 | 0.021 |
| 1095.0 | 0.019 |
| 1094.0 | 0.011 |
| 1093.0 | 0.009 |
| 1092.0 | 0.008 |
| 1091.0 | 0.003 |
| 1090.0 | 0.004 |
| 1089.0 | 0.018 |
| 1088.0 | 0.087 |
| 1087.0 | 0.299 |
| 1086.0 | 0.624 |
| 1085.0 | 0.884 |
| 1084.0 | 0.979 |
| 1083.0 | 0.942 |
| 1082.0 | 2.007 |
| 1081.0 | 2.206 |
| 1080.0 | 3.391 |
| 1079.0 | 3.952 |
| 1078.0 | 4.703 |
| 1077.0 | 5.699 |
| 1076.0 | 5.8 |
| 1075.0 | 5.854 |
| 1074.0 | 5.881 |
| 1073.0 | 5.952 |
| 1072.0 | 6.062 |
| 1071.0 | 6.047 |
| 1070.0 | 6.049 |
| 1069.0 | 6.072 |
| 1068.0 | 6.099 |
| 1067.0 | 6.046 |
| 1066.0 | 6.071 |
| 1065.0 | 6.022 |
| 1064.0 | 6.103 |
| 1063.0 | 6.073 |
| 1062.0 | 6.024 |
| 1061.0 | 6.096 |
| 1060.0 | 6.05 |
| 1059.0 | 6.057 |
| 1058.0 | 6.036 |
| 1057.0 | 6.01 |
| 1056.0 | 5.675 |
| 1055.0 | 5.45 |
| 1054.0 | 5.179 |
| 1053.0 | 5.05 |
| 1052.0 | 4.465 |
| 1051.0 | 4.054 |
| 1050.0 | 3.646 |
| 1049.0 | 3.441 |
| 1048.0 | 3.183 |
| 1047.0 | 2.431 |
| 1046.0 | 1.908 |
| 1045.0 | 1.643 |
| 1044.0 | 1.349 |
| 1043.0 | 0.844 |
| 1042.0 | 0.629 |
| 1041.0 | 0.328 |
| 1040.0 | 0.161 |
| 1039.0 | 0.067 |
| 1038.0 | 0.042 |
| 1037.0 | 0.071 |
| 1036.0 | 0.102 |
| 1035.0 | 0.095 |
| 1034.0 | 0.047 |
| 1033.0 | 0.037 |
| 1032.0 | 0.032 |
| 1031.0 | 0.066 |
| 1030.0 | 0.039 |
| 1029.0 | 0.026 |
| 1028.0 | 0.015 |
| 1027.0 | 0.013 |
| 1026.0 | 0.013 |
| 1025.0 | 0.021 |
| 1024.0 | 0.018 |
| 1023.0 | 0.016 |
| 1022.0 | 0.014 |
| 1021.0 | 0.011 |
| 1020.0 | 0.016 |
| 1019.0 | 0.01 |
| 1018.0 | 0.009 |
| 1017.0 | 0.016 |
| 1016.0 | 0.007 |
| 1015.0 | 0.018 |
| 1014.0 | 0.008 |
| 1013.0 | 0.007 |
| 1012.0 | 0.016 |
| 1011.0 | 0.036 |
| 1010.0 | 0.008 |
| 1009.0 | 0.005 |
| 1008.0 | 0.003 |
| 1007.0 | 0.002 |
| 1006.0 | 0.001 |
| 1005.0 | 0.032 |
| 1004.0 | 0.008 |
| 1003.0 | 0.003 |
| 1002.0 | 0.002 |
| 1001.0 | 0.003 |
| 1000.0 | 0.004 |
| 999.0 | 0.018 |
| 998.0 | 0.005 |
| 997.0 | 0.001 |
| 996.0 | 0.008 |
| 995.0 | 0.025 |
| 994.0 | 0.005 |
| 993.0 | 0.006 |
| 992.0 | 0.006 |
| 991.0 | 0.001 |
| 990.0 | 0.023 |
| 989.0 | 0.015 |
| 988.0 | 0.003 |
| 987.0 | 0.004 |
| 986.0 | 0.005 |
| 985.0 | 0.026 |
| 984.0 | 0.007 |
| 983.0 | 0.003 |
| 982.0 | 0.003 |
| 981.0 | 0.022 |
| 980.0 | 0 |
| 979.0 | 0.007 |
| 978.0 | 0.002 |
| 977.0 | 0.025 |
| 976.0 | 0.014 |
| 975.0 | 0.003 |
| 974.0 | 0.019 |
| 973.0 | 0.007 |
| 972.0 | 0.001 |
| 971.0 | 0.008 |
| 970.0 | 0.032 |
| 969.0 | 0.01 |
| 968.0 | 0.004 |
| 967.0 | 0.002 |
| 966.0 | 0.002 |
| 965.0 | 0.003 |
| 964.0 | 0.026 |
| 963.0 | 0.024 |
| 962.0 | 0.009 |
| 961.0 | 0.026 |
| 960.0 | 0.002 |
| 959.0 | 0.029 |
| 958.0 | 0.026 |
| 957.0 | 0.003 |
| 956.0 | 0.024 |
| 955.0 | 0.001 |
| 954.0 | 0.024 |
| 953.0 | 0.005 |
| 952.0 | 0.004 |
| 951.0 | 0.018 |
| 950.0 | 0.002 |
| 949.0 | 0.018 |
| 948.0 | 0.004 |
| 947.0 | 0.036 |
| 946.0 | 0.037 |
| 945.0 | 0.005 |
| 944.0 | 0.003 |
| 943.0 | 0.005 |
| 942.0 | 0.001 |
| 941.0 | 0.008 |
| 940.0 | 0.024 |
| 939.0 | 0.006 |
| 938.0 | 0 |
| 937.0 | 0.003 |
| 936.0 | 0.016 |
| 935.0 | 0.002 |
| 934.0 | 0.007 |
| 933.0 | 0.012 |
| 932.0 | 0.027 |
| 931.0 | 0.026 |
| 930.0 | 0.001 |
| 929.0 | 0.009 |
| 928.0 | 0.001 |
| 927.0 | 0.023 |
| 926.0 | 0.021 |
| 925.0 | 0.003 |
| 924.0 | 0.007 |
| 923.0 | 0.004 |
| 922.0 | 0.004 |
| 921.0 | 0.018 |
| 920.0 | 0.007 |
| 919.0 | 0.003 |
| 918.0 | 0.005 |
| 917.0 | 0 |
| 916.0 | 0.008 |
| 915.0 | 0.019 |
| 914.0 | 0.011 |
| 913.0 | 0.013 |
| 912.0 | 0.019 |
| 911.0 | 0.004 |
| 910.0 | 0.005 |
| 909.0 | 0.002 |
| 908.0 | 0.001 |
| 907.0 | 0.003 |
| 906.0 | 0.005 |
| 905.0 | 0.007 |
| 904.0 | 0.012 |
| 903.0 | 0.004 |
| 902.0 | 0.002 |
| 901.0 | 0.011 |
| 900.0 | 0.027 |
| 899.0 | 0.01 |
| 898.0 | 0.001 |
| 897.0 | 0.005 |
| 896.0 | 0.002 |
| 895.0 | 0 |
| 894.0 | 0.013 |
| 893.0 | 0.038 |
| 892.0 | 0.025 |
| 891.0 | 0.005 |
| 890.0 | 0.005 |
| 889.0 | 0.001 |
| 888.0 | 0.001 |
| 887.0 | 0.006 |
| 886.0 | 0.011 |
| 885.0 | 0.014 |
| 884.0 | 0.017 |
| 883.0 | 0.004 |
| 882.0 | 0.001 |
| 881.0 | 0.003 |
| 880.0 | 0.007 |
| 879.0 | 0.011 |
| 878.0 | 0.005 |
| 877.0 | 0.002 |
| 876.0 | 0.007 |
| 875.0 | 0.021 |
| 874.0 | 0.012 |
| 873.0 | 0.005 |
| 872.0 | 0.008 |
| 871.0 | 0.005 |
| 870.0 | 0.002 |
| 869.0 | 0.002 |
| 868.0 | 0.017 |
| 867.0 | 0.023 |
| 866.0 | 0.013 |
| 865.0 | 0.004 |
| 864.0 | 0.001 |
| 863.0 | 0.003 |
| 862.0 | 0.004 |
| 861.0 | 0.004 |
| 860.0 | 0.007 |
| 859.0 | 0.006 |
| 858.0 | 0.006 |
| 857.0 | 0.004 |
| 856.0 | 0.003 |
| 855.0 | 0.002 |
| 854.0 | 0.005 |
| 853.0 | 0.003 |
| 852.0 | 0.002 |
| 851.0 | 0.004 |
| 850.0 | 0.002 |
| 849.0 | 0.002 |
| 848.0 | 0.005 |
| 847.0 | 0.006 |
| 846.0 | 0.005 |
| 845.0 | 0.006 |
| 844.0 | 0.004 |
| 843.0 | 0.004 |
| 842.0 | 0.003 |
| 841.0 | 0.002 |
| 840.0 | 0.005 |
| 839.0 | 0.004 |
| 838.0 | 0.003 |
| 837.0 | 0.006 |
| 836.0 | 0.005 |
| 835.0 | 0.005 |
| 834.0 | 0.005 |
| 833.0 | 0.005 |
| 832.0 | 0.005 |
| 831.0 | 0.005 |
| 830.0 | 0.003 |
| 829.0 | 0.004 |
| 828.0 | 0.005 |
| 827.0 | 0.007 |
| 826.0 | 0.007 |
| 825.0 | 0.006 |
| 824.0 | 0.003 |
| 823.0 | 0 |
| 822.0 | 0 |
| 821.0 | 0.003 |
| 820.0 | 0.008 |
| 819.0 | 0.009 |
| 818.0 | 0.006 |
| 817.0 | 0.004 |
| 816.0 | 0.004 |
| 815.0 | 0.003 |
| 814.0 | 0.002 |
| 813.0 | 0.006 |
| 812.0 | 0.004 |
| 811.0 | 0.002 |
| 810.0 | 0.002 |
| 809.0 | 0.003 |
| 808.0 | 0.003 |
| 807.0 | 0.003 |
| 806.0 | 0.003 |
| 805.0 | 0.004 |
| 804.0 | 0.004 |
| 803.0 | 0.004 |
| 802.0 | 0.005 |
| 801.0 | 0.004 |
| 800.0 | 0.003 |
| 799.0 | 0.004 |
| 798.0 | 0.004 |
| 797.0 | 0.004 |
| 796.0 | 0.004 |
| 795.0 | 0.004 |
| 794.0 | 0.004 |
| 793.0 | 0.004 |
| 792.0 | 0.004 |
| 791.0 | 0.004 |
| 790.0 | 0.005 |
| 789.0 | 0.004 |
| 788.0 | 0.004 |
| 787.0 | 0.004 |
| 786.0 | 0.004 |
| 785.0 | 0.004 |
| 784.0 | 0.004 |
| 783.0 | 0.004 |
| 782.0 | 0.003 |
| 781.0 | 0.005 |
| 780.0 | 0.016 |
| 779.0 | 0.042 |
| 778.0 | 0.059 |
| 777.0 | 0.056 |
| 776.0 | 0.063 |
| 775.0 | 0.076 |
| 774.0 | 0.094 |
| 773.0 | 0.116 |
| 772.0 | 0.116 |
| 771.0 | 0.117 |
| 770.0 | 0.136 |
| 769.0 | 0.189 |
| 768.0 | 0.227 |
| 767.0 | 0.244 |
| 766.0 | 0.299 |
| 765.0 | 0.294 |
| 764.0 | 0.279 |
| 763.0 | 0.275 |
| 762.0 | 0.283 |
| 761.0 | 0.299 |
| 760.0 | 0.289 |
| 759.0 | 0.293 |
| 758.0 | 0.297 |
| 757.0 | 0.285 |
| 756.0 | 0.31 |
| 755.0 | 0.349 |
| 754.0 | 0.4 |
| 753.0 | 0.463 |
| 752.0 | 0.503 |
| 751.0 | 0.538 |
| 750.0 | 0.586 |
| 749.0 | 0.652 |
| 748.0 | 0.701 |
| 747.0 | 0.734 |
| 746.0 | 0.75 |
| 745.0 | 0.745 |
| 744.0 | 0.74 |
| 743.0 | 0.727 |
| 742.0 | 0.766 |
| 741.0 | 0.859 |
| 740.0 | 0.976 |
| 739.0 | 1.06 |
| 738.0 | 1.068 |
| 737.0 | 1.075 |
| 736.0 | 1.136 |
| 735.0 | 1.215 |
| 734.0 | 1.256 |
| 733.0 | 1.285 |
| 732.0 | 1.409 |
| 731.0 | 1.57 |
| 730.0 | 1.55 |
| 729.0 | 1.464 |
| 728.0 | 1.523 |
| 727.0 | 1.742 |
| 726.0 | 1.969 |
| 725.0 | 2.118 |
| 724.0 | 2.303 |
| 723.0 | 2.461 |
| 722.0 | 2.634 |
| 721.0 | 2.961 |
| 720.0 | 3.359 |
| 719.0 | 3.75 |
| 718.0 | 4.209 |
| 717.0 | 4.858 |
| 716.0 | 4.574 |
| 715.0 | 4.416 |
| 714.0 | 4.481 |
| 713.0 | 4.717 |
| 712.0 | 4.256 |
| 711.0 | 4.318 |
| 710.0 | 4.693 |
| 709.0 | 4.3 |
| 708.0 | 4.54 |
| 707.0 | 4.892 |
| 706.0 | 4.256 |
| 705.0 | 4.359 |
| 704.0 | 4.215 |
| 703.0 | 4.494 |
| 702.0 | 4.716 |
| 701.0 | 4.971 |
| 700.0 | 4.308 |
| 699.0 | 4.403 |
| 698.0 | 4.308 |
| 697.0 | 4.439 |
| 696.0 | 4.795 |
| 695.0 | 4.825 |
| 694.0 | 4.223 |
| 693.0 | 4.358 |
| 692.0 | 4.207 |
| 691.0 | 4.272 |
| 690.0 | 4.74 |
| 689.0 | 4.357 |
| 688.0 | 4.263 |
| 687.0 | 4.263 |
| 686.0 | 4.298 |
| 685.0 | 4.465 |
| 684.0 | 4.479 |
| 683.0 | 5.125 |
| 682.0 | 4.157 |
| 681.0 | 4.254 |
| 680.0 | 4.221 |
| 679.0 | 4.39 |
| 678.0 | 4.765 |
| 677.0 | 4.555 |
| 676.0 | 4.199 |
| 675.0 | 4.413 |
| 674.0 | 4.124 |
| 673.0 | 4.316 |
| 672.0 | 4.438 |
| 671.0 | 4.739 |
| 670.0 | 4.143 |
| 669.0 | 4.27 |
| 668.0 | 4.261 |
| 667.0 | 4.589 |
| 666.0 | 4.507 |
| 665.0 | 4.928 |
| 664.0 | 4.184 |
| 663.0 | 4.253 |
| 662.0 | 4.236 |
| 661.0 | 4.253 |
| 660.0 | 4.646 |
| 659.0 | 4.537 |
| 658.0 | 4.162 |
| 657.0 | 4.228 |
| 656.0 | 4.149 |
| 655.0 | 4.236 |
| 654.0 | 4.506 |
| 653.0 | 4.69 |
| 652.0 | 4.278 |
| 651.0 | 4.212 |
| 650.0 | 4.228 |
| 649.0 | 4.228 |
| 648.0 | 4.822 |
| 647.0 | 4.506 |
| 646.0 | 4.26 |
| 645.0 | 4.26 |
| 644.0 | 4.129 |
| 643.0 | 4.168 |
| 642.0 | 4.689 |
| 641.0 | 4.423 |
| 640.0 | 4.252 |
| 639.0 | 4.122 |
| 638.0 | 4.26 |
| 637.0 | 4.277 |
| 636.0 | 4.666 |
| 635.0 | 4.505 |
| 634.0 | 4.334 |
| 633.0 | 4.196 |
| 632.0 | 4.219 |
| 631.0 | 4.204 |
| 630.0 | 4.888 |
| 629.0 | 4.365 |
| 628.0 | 4.268 |
| 627.0 | 4.259 |
| 626.0 | 4.333 |
| 625.0 | 4.154 |
| 624.0 | 4.624 |
| 623.0 | 4.387 |
| 622.0 | 4.203 |
| 621.0 | 4.211 |
| 620.0 | 4.242 |
| 619.0 | 4.16 |
| 618.0 | 4.586 |
| 617.0 | 4.333 |
| 616.0 | 4.226 |
| 615.0 | 4.234 |
| 614.0 | 4.25 |
| 613.0 | 4.267 |
| 612.0 | 4.624 |
| 611.0 | 4.551 |
| 610.0 | 4.259 |
| 609.0 | 4.127 |
| 608.0 | 4.115 |
| 607.0 | 4.195 |
| 606.0 | 4.504 |
| 605.0 | 4.461 |
| 604.0 | 4.188 |
| 603.0 | 4.233 |
| 602.0 | 4.166 |
| 601.0 | 4.233 |
| 600.0 | 4.551 |
| 599.0 | 4.447 |
| 598.0 | 4.188 |
| 597.0 | 4.275 |
| 596.0 | 4.353 |
| 595.0 | 4.241 |
| 594.0 | 4.46 |
| 593.0 | 4.434 |
| 592.0 | 4.195 |
| 591.0 | 4.166 |
| 590.0 | 4.139 |
| 589.0 | 4.249 |
| 588.0 | 4.488 |
| 587.0 | 4.664 |
| 586.0 | 4.202 |
| 585.0 | 4.249 |
| 584.0 | 4.266 |
| 583.0 | 4.217 |
| 582.0 | 4.474 |
| 581.0 | 4.533 |
| 580.0 | 4.194 |
| 579.0 | 4.145 |
| 578.0 | 4.138 |
| 577.0 | 4.302 |
| 576.0 | 4.42 |
| 575.0 | 4.473 |
| 574.0 | 4.113 |
| 573.0 | 4.145 |
| 572.0 | 4.132 |
| 571.0 | 4.265 |
| 570.0 | 4.502 |
| 569.0 | 4.517 |
| 568.0 | 4.193 |
| 567.0 | 4.208 |
| 566.0 | 4.32 |
| 565.0 | 4.24 |
| 564.0 | 4.487 |
| 563.0 | 4.445 |
| 562.0 | 4.158 |
| 561.0 | 4.187 |
| 560.0 | 4.194 |
| 559.0 | 4.275 |
| 558.0 | 4.152 |
| 557.0 | 4.293 |
| 556.0 | 4.567 |
| 555.0 | 4.446 |
| 554.0 | 4.152 |
| 553.0 | 4.311 |
| 552.0 | 4.283 |
| 551.0 | 4.363 |
| 550.0 | 4.473 |
| 549.0 | 4.362 |
| 548.0 | 4.132 |
| 547.0 | 4.172 |
| 546.0 | 4.144 |
| 545.0 | 4.24 |
| 544.0 | 4.408 |
| 543.0 | 4.331 |
| 542.0 | 4.151 |
| 541.0 | 4.208 |
| 540.0 | 4.185 |
| 539.0 | 4.24 |
| 538.0 | 4.487 |
| 537.0 | 4.373 |
| 536.0 | 4.171 |
| 535.0 | 4.15 |
| 534.0 | 4.124 |
| 533.0 | 4.223 |
| 532.0 | 4.516 |
| 531.0 | 4.383 |
| 530.0 | 4.215 |
| 529.0 | 4.171 |
| 528.0 | 4.137 |
| 527.0 | 4.23 |
| 526.0 | 4.5 |
| 525.0 | 4.3 |
| 524.0 | 4.13 |
| 523.0 | 4.149 |
| 522.0 | 4.199 |
| 521.0 | 4.309 |
| 520.0 | 4.6 |
| 519.0 | 4.418 |
| 518.0 | 4.6 |
| 517.0 | 4.281 |
| 516.0 | 3.858 |
| 515.0 | 3.872 |
| 514.0 | 4.012 |
| 513.0 | 4.338 |
| 512.0 | 4.847 |
| 511.0 | 4.581 |
| 510.0 | 3.718 |
| 509.0 | 2.903 |
| 508.0 | 2.361 |
| 507.0 | 2.096 |
| 506.0 | 2.066 |
| 505.0 | 2.214 |
| 504.0 | 2.293 |
| 503.0 | 2.143 |
| 502.0 | 2.073 |
| 501.0 | 2.2 |
| 500.0 | 2.484 |
| 499.0 | 2.685 |
| 498.0 | 2.528 |
| 497.0 | 2.331 |
| 496.0 | 2.275 |
| 495.0 | 2.356 |
| 494.0 | 2.538 |
| 493.0 | 2.788 |
| 492.0 | 3 |
| 491.0 | 3.043 |
| 490.0 | 2.839 |
| 489.0 | 2.434 |
| 488.0 | 2.157 |
| 487.0 | 2.099 |
| 486.0 | 2.195 |
| 485.0 | 2.205 |
| 484.0 | 2.095 |
| 483.0 | 2.099 |
| 482.0 | 2.168 |
| 481.0 | 2.066 |
| 480.0 | 1.937 |
| 479.0 | 1.971 |
| 478.0 | 2.144 |
| 477.0 | 2.18 |
| 476.0 | 1.911 |
| 475.0 | 1.639 |
| 474.0 | 1.498 |
| 473.0 | 1.478 |
| 472.0 | 1.478 |
| 471.0 | 1.379 |
| 470.0 | 1.272 |
| 469.0 | 1.3 |
| 468.0 | 1.517 |
| 467.0 | 1.834 |
| 466.0 | 1.889 |
| 465.0 | 1.708 |
| 464.0 | 1.562 |
| 463.0 | 1.515 |
| 462.0 | 1.553 |
| 461.0 | 1.642 |
| 460.0 | 1.772 |
| 459.0 | 1.945 |
| 458.0 | 2.207 |
| 457.0 | 2.597 |
| 456.0 | 2.889 |
| 455.0 | 2.926 |
| 454.0 | 3.046 |
| 453.0 | 3.426 |
| 452.0 | 4.809 |
| 451.0 | 4.222 |
| 450.0 | 4.23 |
| 449.0 | 4.523 |
| 448.0 | 5.353 |
| 447.0 | 4.523 |
| 446.0 | 4.321 |
| 445.0 | 4.273 |
| 444.0 | 4.229 |
| 443.0 | 4.374 |
| 442.0 | 4.491 |
| 441.0 | 4.205 |
| 440.0 | 4.147 |
| 439.0 | 4.237 |
| 438.0 | 4.16 |
| 437.0 | 4.34 |
| 436.0 | 4.63 |
| 435.0 | 4.309 |
| 434.0 | 4.204 |
| 433.0 | 4.219 |
| 432.0 | 4.126 |
| 431.0 | 4.395 |
| 430.0 | 4.59 |
| 429.0 | 4.349 |
| 428.0 | 4.298 |
| 427.0 | 4.307 |
| 426.0 | 4.279 |
| 425.0 | 5.951 |
| 424.0 | 3.643 |
| 423.0 | 3.326 |
| 422.0 | 3.437 |
| 421.0 | 3.954 |
| 420.0 | 4.406 |
| 419.0 | 3.829 |
| 418.0 | 2.818 |
| 417.0 | 2.522 |
| 416.0 | 2.601 |
| 415.0 | 2.92 |
| 414.0 | 3.201 |
| 413.0 | 3.202 |
| 412.0 | 3.029 |
| 411.0 | 2.934 |
| 410.0 | 3.105 |
| 409.0 | 3.212 |
| 408.0 | 3.028 |
| 407.0 | 3.034 |
| 406.0 | 3.278 |
| 405.0 | 3.431 |
| 404.0 | 3.367 |
| 403.0 | 3.335 |
| 402.0 | 2.674 |
| 401.0 | 2.302 |
| 400.0 | 2.129 |
| 399.0 | 2.112 |
| 398.0 | 2.293 |
| 397.0 | 2.657 |
| 396.0 | 2.881 |
| 395.0 | 2.897 |
| 394.0 | 2.867 |
| 393.0 | 2.303 |
| 392.0 | 1.998 |
| 391.0 | 2.012 |
| 390.0 | 2.141 |
| 389.0 | 2.145 |
| 388.0 | 2.193 |
| 387.0 | 2.234 |
| 386.0 | 1.899 |
| 385.0 | 1.588 |
| 384.0 | 1.477 |
| 383.0 | 1.505 |
| 382.0 | 1.639 |
| 381.0 | 1.899 |
| 380.0 | 1.904 |
| 379.0 | 1.614 |
| 378.0 | 1.367 |
| 377.0 | 1.255 |
| 376.0 | 1.314 |
| 375.0 | 1.562 |
| 374.0 | 1.934 |
| 373.0 | 2.307 |
| 372.0 | 2.739 |
| 371.0 | 3.365 |
| 370.0 | 4.596 |
| 369.0 | 4.792 |
| 368.0 | 4.576 |
| 367.0 | 5.461 |
| 366.0 | 5.239 |
| 365.0 | 4.324 |
| 364.0 | 4.393 |
| 363.0 | 4.255 |
| 362.0 | 4.229 |
| 361.0 | 4.522 |
| 360.0 | 4.635 |
| 359.0 | 4.264 |
| 358.0 | 4.228 |
| 357.0 | 4.367 |
| 356.0 | 4.302 |
| 355.0 | 4.458 |
| 354.0 | 4.656 |
| 353.0 | 4.202 |
| 352.0 | 4.186 |
| 351.0 | 4.343 |
| 350.0 | 4.262 |
| 349.0 | 4.519 |
| 348.0 | 4.788 |
| 347.0 | 4.218 |
| 346.0 | 4.243 |
| 345.0 | 4.134 |
| 344.0 | 4.299 |
| 343.0 | 4.414 |
| 342.0 | 4.677 |
| 341.0 | 4.192 |
| 340.0 | 4.147 |
| 339.0 | 4.363 |
| 338.0 | 4.259 |
| 337.0 | 4.44 |
| 336.0 | 4.727 |
| 335.0 | 4.168 |
| 334.0 | 4.215 |
| 333.0 | 4.167 |
| 332.0 | 4.268 |
| 331.0 | 4.651 |
| 330.0 | 4.608 |
| 329.0 | 4.248 |
| 328.0 | 4.151 |
| 327.0 | 4.549 |
| 326.0 | 4.338 |
| 325.0 | 4.567 |
| 324.0 | 4.481 |
| 323.0 | 4.221 |
| 322.0 | 4.165 |
| 321.0 | 4.513 |
| 320.0 | 4.229 |
| 319.0 | 4.605 |
| 318.0 | 4.235 |
| 317.0 | 4.217 |
| 316.0 | 4.406 |
| 315.0 | 4.225 |
| 314.0 | 4.301 |
| 313.0 | 4.81 |
| 312.0 | 4.844 |
| 311.0 | 4.332 |
| 310.0 | 4.251 |
| 309.0 | 4.198 |
| 308.0 | 4.32 |
| 307.0 | 4.746 |
| 306.0 | 4.746 |
| 305.0 | 4.309 |
| 304.0 | 4.288 |
| 303.0 | 4.458 |
| 302.0 | 4.297 |
| 301.0 | 4.598 |
| 300.0 | 4.92 |
| 299.0 | 4.329 |
| 298.0 | 4.257 |
| 297.0 | 4.328 |
| 296.0 | 4.317 |
| 295.0 | 4.597 |
| 294.0 | 5.317 |
| 293.0 | 4.256 |
| 292.0 | 4.284 |
| 291.0 | 4.503 |
| 290.0 | 4.264 |
| 289.0 | 4.713 |
| 288.0 | 5.139 |
| 287.0 | 4.192 |
| 286.0 | 4.244 |
| 285.0 | 4.123 |
| 284.0 | 4.292 |
| 283.0 | 4.573 |
| 282.0 | 4.961 |
| 281.0 | 4.191 |
| 280.0 | 4.271 |
| 279.0 | 4.198 |
| 278.0 | 4.129 |
| 277.0 | 4.613 |
| 276.0 | 5.215 |
| 275.0 | 4.158 |
| 274.0 | 4.241 |
| 273.0 | 4.189 |
| 272.0 | 4.29 |
| 271.0 | 4.834 |
| 270.0 | 4.766 |
| 269.0 | 4.196 |
| 268.0 | 4.156 |
| 267.0 | 4.514 |
| 266.0 | 4.55 |
| 265.0 | 5.009 |
| 264.0 | 4.766 |
| 263.0 | 4.221 |
| 262.0 | 4.156 |
| 261.0 | 4.434 |
| 260.0 | 4.14 |
| 259.0 | 4.735 |
| 258.0 | 4.496 |
| 257.0 | 4.229 |
| 256.0 | 4.139 |
| 255.0 | 4.404 |
| 254.0 | 4.169 |
| 253.0 | 4.909 |
| 252.0 | 4.477 |
| 251.0 | 4.295 |
| 250.0 | 4.152 |
| 249.0 | 4.585 |
| 248.0 | 4.094 |
| 247.0 | 4.73 |
| 246.0 | 4.627 |
| 245.0 | 4.243 |
| 244.0 | 4.19 |
| 243.0 | 4.206 |
| 242.0 | 4.165 |
| 241.0 | 5.06 |
| 240.0 | 4.362 |
| 239.0 | 4.243 |
| 238.0 | 4.067 |
| 237.0 | 4.563 |
| 236.0 | 4.086 |
| 235.0 | 4.759 |
| 234.0 | 4.508 |
| 233.0 | 4.134 |
| 232.0 | 4.141 |
| 231.0 | 4.427 |
| 230.0 | 4.126 |
| 229.0 | 4.824 |
| 228.0 | 4.561 |
| 227.0 | 4.17 |
| 226.0 | 4.161 |
| 225.0 | 4.168 |
| 224.0 | 4.21 |
| 223.0 | 4.644 |
| 222.0 | 4.436 |
| 221.0 | 4.149 |
| 220.0 | 4.111 |
| 219.0 | 4.283 |
| 218.0 | 4.187 |
| 217.0 | 4.552 |
| 216.0 | 4.416 |
| 215.0 | 4.107 |
| 214.0 | 4.121 |
| 213.0 | 4.027 |
| 212.0 | 4.174 |
| 211.0 | 4.31 |
| 210.0 | 4.344 |
| 209.0 | 4.075 |
| 208.0 | 4.08 |
| 207.0 | 4.214 |
| 206.0 | 4.122 |
| 205.0 | 4.222 |
| 204.0 | 4.221 |
| 203.0 | 3.914 |
| 202.0 | 3.909 |
| 201.0 | 3.832 |
| 200.0 | 3.867 |